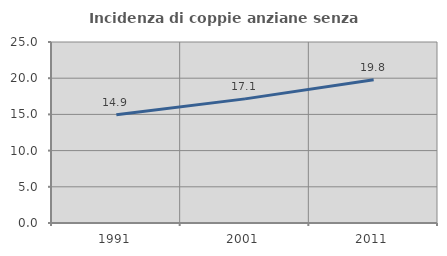
| Category | Incidenza di coppie anziane senza figli  |
|---|---|
| 1991.0 | 14.948 |
| 2001.0 | 17.143 |
| 2011.0 | 19.799 |